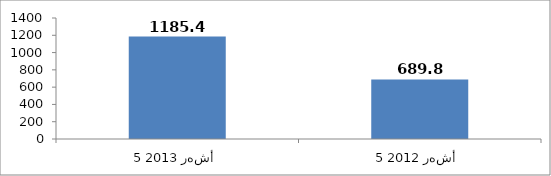
| Category | Series 0 |
|---|---|
| 5 أشهر 2013 | 1185.4 |
| 5 أشهر 2012 | 689.8 |